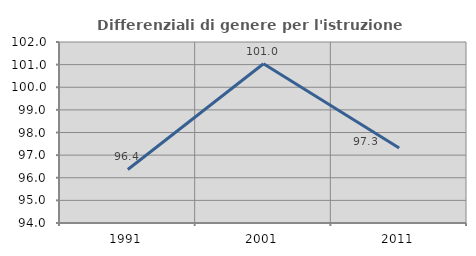
| Category | Differenziali di genere per l'istruzione superiore |
|---|---|
| 1991.0 | 96.367 |
| 2001.0 | 101.037 |
| 2011.0 | 97.312 |